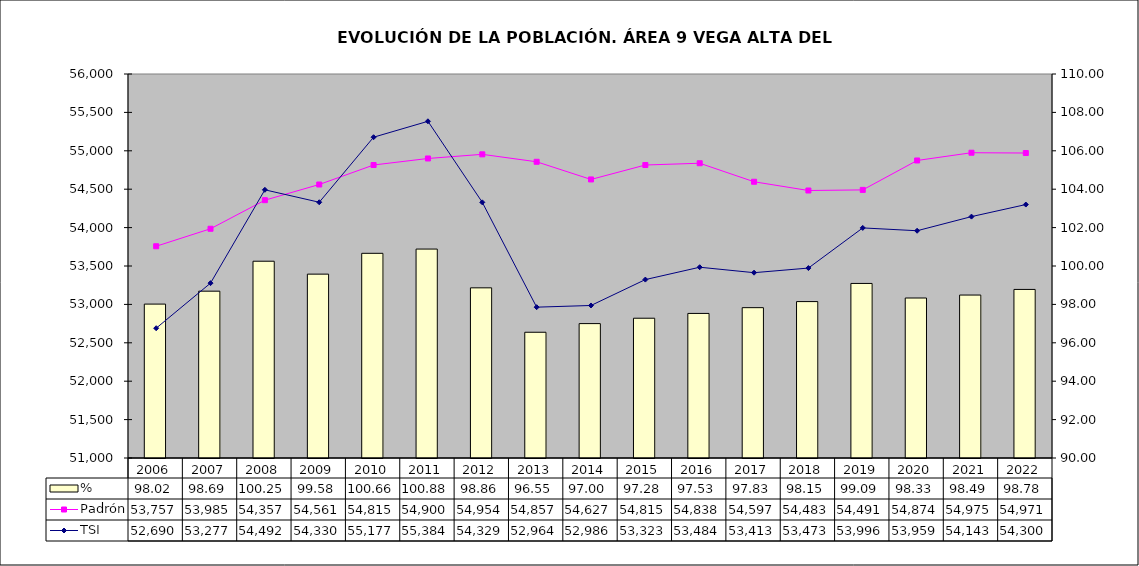
| Category | % |
|---|---|
| 2006.0 | 98.015 |
| 2007.0 | 98.689 |
| 2008.0 | 100.248 |
| 2009.0 | 99.577 |
| 2010.0 | 100.66 |
| 2011.0 | 100.882 |
| 2012.0 | 98.863 |
| 2013.0 | 96.549 |
| 2014.0 | 97 |
| 2015.0 | 97.28 |
| 2016.0 | 97.53 |
| 2017.0 | 97.83 |
| 2018.0 | 98.146 |
| 2019.0 | 99.092 |
| 2020.0 | 98.333 |
| 2021.0 | 98.487 |
| 2022.0 | 98.779 |